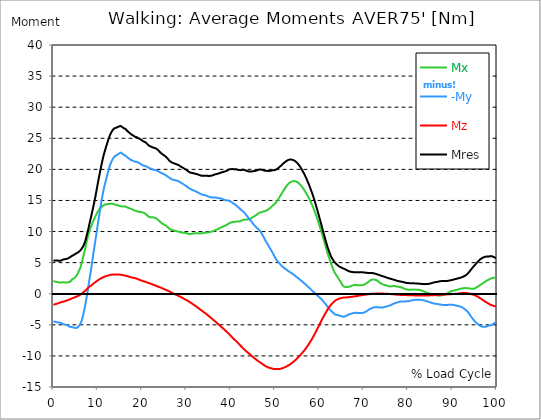
| Category |  Mx |  -My |  Mz |  Mres |
|---|---|---|---|---|
| 0.0 | 2.055 | -4.466 | -1.765 | 5.36 |
| 0.1647276845464841 | 2.007 | -4.449 | -1.733 | 5.312 |
| 0.3294553690929682 | 1.959 | -4.49 | -1.701 | 5.32 |
| 0.5044785339236075 | 1.935 | -4.538 | -1.669 | 5.336 |
| 0.6692062184700917 | 1.91 | -4.578 | -1.636 | 5.352 |
| 0.8339339030165757 | 1.878 | -4.595 | -1.596 | 5.344 |
| 0.9986615875630598 | 1.846 | -4.611 | -1.548 | 5.328 |
| 1.1633892721095438 | 1.806 | -4.635 | -1.515 | 5.32 |
| 1.3384124369401833 | 1.806 | -4.635 | -1.467 | 5.296 |
| 1.5031401214866673 | 1.822 | -4.651 | -1.419 | 5.304 |
| 1.6678678060331513 | 1.822 | -4.683 | -1.378 | 5.32 |
| 1.8325954905796356 | 1.822 | -4.74 | -1.346 | 5.36 |
| 1.9973231751261196 | 1.846 | -4.812 | -1.314 | 5.433 |
| 2.1620508596726036 | 1.83 | -4.877 | -1.298 | 5.481 |
| 2.337074024503243 | 1.822 | -4.925 | -1.266 | 5.522 |
| 2.501801709049727 | 1.814 | -4.949 | -1.225 | 5.538 |
| 2.666529393596211 | 1.814 | -4.973 | -1.185 | 5.554 |
| 2.8312570781426953 | 1.814 | -5.014 | -1.137 | 5.578 |
| 2.9959847626891793 | 1.822 | -5.054 | -1.096 | 5.61 |
| 3.1710079275198186 | 1.846 | -5.086 | -1.048 | 5.642 |
| 3.3357356120663026 | 1.838 | -5.143 | -1.008 | 5.691 |
| 3.500463296612787 | 1.806 | -5.247 | -0.975 | 5.763 |
| 3.665190981159271 | 1.878 | -5.304 | -0.927 | 5.844 |
| 3.8299186657057547 | 2.007 | -5.328 | -0.871 | 5.925 |
| 4.004941830536394 | 2.128 | -5.352 | -0.822 | 5.997 |
| 4.169669515082878 | 2.265 | -5.36 | -0.766 | 6.07 |
| 4.334397199629363 | 2.354 | -5.376 | -0.709 | 6.134 |
| 4.499124884175846 | 2.426 | -5.401 | -0.661 | 6.182 |
| 4.663852568722331 | 2.499 | -5.457 | -0.613 | 6.263 |
| 4.8285802532688145 | 2.587 | -5.489 | -0.572 | 6.336 |
| 5.003603418099454 | 2.7 | -5.522 | -0.532 | 6.416 |
| 5.168331102645938 | 2.821 | -5.53 | -0.484 | 6.489 |
| 5.333058787192422 | 3.031 | -5.473 | -0.435 | 6.561 |
| 5.497786471738906 | 3.265 | -5.384 | -0.379 | 6.626 |
| 5.662514156285391 | 3.522 | -5.264 | -0.314 | 6.698 |
| 5.83753732111603 | 3.78 | -5.135 | -0.25 | 6.803 |
| 6.0022650056625135 | 4.038 | -4.957 | -0.185 | 6.9 |
| 6.166992690208998 | 4.353 | -4.748 | -0.113 | 7.029 |
| 6.331720374755482 | 4.796 | -4.417 | -0.032 | 7.174 |
| 6.496448059301967 | 5.264 | -4.038 | 0.064 | 7.319 |
| 6.671471224132605 | 5.731 | -3.579 | 0.169 | 7.545 |
| 6.836198908679089 | 6.223 | -3.063 | 0.274 | 7.795 |
| 7.000926593225574 | 6.714 | -2.523 | 0.371 | 8.085 |
| 7.165654277772057 | 7.222 | -1.926 | 0.476 | 8.415 |
| 7.330381962318542 | 7.762 | -1.282 | 0.588 | 8.794 |
| 7.495109646865026 | 8.335 | -0.556 | 0.709 | 9.294 |
| 7.670132811695664 | 8.883 | 0.161 | 0.83 | 9.794 |
| 7.8348604962421495 | 9.342 | 0.879 | 0.943 | 10.253 |
| 7.999588180788634 | 9.753 | 1.636 | 1.056 | 10.769 |
| 8.164315865335118 | 10.124 | 2.418 | 1.153 | 11.325 |
| 8.329043549881602 | 10.463 | 3.16 | 1.233 | 11.849 |
| 8.504066714712243 | 10.777 | 3.909 | 1.322 | 12.357 |
| 8.668794399258726 | 11.075 | 4.691 | 1.411 | 12.865 |
| 8.833522083805208 | 11.414 | 5.505 | 1.515 | 13.421 |
| 8.998249768351693 | 11.68 | 6.328 | 1.612 | 13.953 |
| 9.162977452898177 | 11.922 | 7.118 | 1.709 | 14.517 |
| 9.338000617728817 | 12.188 | 7.899 | 1.798 | 15.106 |
| 9.5027283022753 | 12.462 | 8.673 | 1.886 | 15.702 |
| 9.667455986821786 | 12.712 | 9.463 | 1.967 | 16.339 |
| 9.83218367136827 | 12.953 | 10.277 | 2.055 | 16.992 |
| 9.996911355914754 | 13.171 | 11.075 | 2.144 | 17.645 |
| 10.171934520745392 | 13.364 | 11.833 | 2.217 | 18.273 |
| 10.336662205291876 | 13.55 | 12.583 | 2.297 | 18.894 |
| 10.501389889838359 | 13.719 | 13.34 | 2.37 | 19.507 |
| 10.666117574384844 | 13.848 | 14.074 | 2.442 | 20.095 |
| 10.830845258931328 | 13.945 | 14.783 | 2.499 | 20.659 |
| 10.995572943477812 | 14.034 | 15.46 | 2.563 | 21.207 |
| 11.170596108308452 | 14.122 | 16.129 | 2.628 | 21.748 |
| 11.335323792854936 | 14.219 | 16.734 | 2.684 | 22.247 |
| 11.50005147740142 | 14.291 | 17.25 | 2.741 | 22.683 |
| 11.664779161947905 | 14.34 | 17.733 | 2.781 | 23.086 |
| 11.829506846494388 | 14.372 | 18.209 | 2.821 | 23.489 |
| 12.004530011325027 | 14.388 | 18.676 | 2.862 | 23.867 |
| 12.169257695871512 | 14.396 | 19.144 | 2.894 | 24.254 |
| 12.333985380417996 | 14.412 | 19.587 | 2.926 | 24.617 |
| 12.498713064964479 | 14.428 | 20.031 | 2.966 | 24.98 |
| 12.663440749510965 | 14.453 | 20.45 | 2.999 | 25.334 |
| 12.838463914341604 | 14.469 | 20.78 | 3.023 | 25.609 |
| 13.003191598888087 | 14.493 | 21.046 | 3.047 | 25.834 |
| 13.167919283434573 | 14.493 | 21.361 | 3.063 | 26.092 |
| 13.332646967981058 | 14.501 | 21.562 | 3.071 | 26.261 |
| 13.497374652527538 | 14.477 | 21.78 | 3.079 | 26.423 |
| 13.662102337074025 | 14.412 | 21.933 | 3.087 | 26.527 |
| 13.837125501904662 | 14.348 | 22.086 | 3.095 | 26.616 |
| 14.001853186451148 | 14.316 | 22.159 | 3.095 | 26.656 |
| 14.166580870997631 | 14.283 | 22.239 | 3.103 | 26.705 |
| 14.331308555544114 | 14.243 | 22.336 | 3.103 | 26.761 |
| 14.4960362400906 | 14.227 | 22.376 | 3.095 | 26.793 |
| 14.671059404921238 | 14.179 | 22.425 | 3.079 | 26.802 |
| 14.835787089467724 | 14.154 | 22.57 | 3.079 | 26.914 |
| 15.000514774014206 | 14.138 | 22.723 | 3.071 | 27.035 |
| 15.165242458560689 | 14.09 | 22.683 | 3.055 | 26.971 |
| 15.329970143107175 | 14.034 | 22.642 | 3.031 | 26.906 |
| 15.504993307937815 | 14.025 | 22.562 | 3.007 | 26.826 |
| 15.669720992484299 | 14.009 | 22.473 | 2.982 | 26.737 |
| 15.834448677030782 | 14.009 | 22.368 | 2.958 | 26.64 |
| 15.999176361577268 | 14.017 | 22.28 | 2.934 | 26.56 |
| 16.16390404612375 | 14.017 | 22.255 | 2.91 | 26.544 |
| 16.33892721095439 | 14.001 | 22.191 | 2.886 | 26.471 |
| 16.503654895500876 | 13.953 | 22.054 | 2.853 | 26.318 |
| 16.668382580047357 | 13.88 | 21.917 | 2.821 | 26.165 |
| 16.833110264593845 | 13.816 | 21.852 | 2.797 | 26.068 |
| 16.997837949140326 | 13.792 | 21.772 | 2.757 | 25.979 |
| 17.16256563368681 | 13.751 | 21.691 | 2.724 | 25.891 |
| 17.33758879851745 | 13.703 | 21.602 | 2.684 | 25.778 |
| 17.502316483063932 | 13.647 | 21.498 | 2.644 | 25.657 |
| 17.667044167610417 | 13.606 | 21.449 | 2.62 | 25.584 |
| 17.8317718521569 | 13.558 | 21.425 | 2.596 | 25.536 |
| 17.996499536703386 | 13.518 | 21.361 | 2.571 | 25.447 |
| 18.171522701534023 | 13.445 | 21.304 | 2.547 | 25.359 |
| 18.33625038608051 | 13.364 | 21.256 | 2.515 | 25.27 |
| 18.500978070626992 | 13.324 | 21.216 | 2.491 | 25.214 |
| 18.665705755173477 | 13.292 | 21.183 | 2.458 | 25.165 |
| 18.83043343971996 | 13.26 | 21.216 | 2.418 | 25.173 |
| 19.0054566045506 | 13.219 | 21.151 | 2.37 | 25.093 |
| 19.170184289097087 | 13.187 | 21.07 | 2.321 | 25.004 |
| 19.33491197364357 | 13.163 | 20.998 | 2.273 | 24.923 |
| 19.499639658190056 | 13.179 | 20.958 | 2.225 | 24.891 |
| 19.66436734273654 | 13.171 | 20.901 | 2.176 | 24.843 |
| 19.82909502728302 | 13.139 | 20.821 | 2.128 | 24.754 |
| 20.004118192113662 | 13.098 | 20.724 | 2.088 | 24.641 |
| 20.168845876660146 | 13.066 | 20.643 | 2.047 | 24.561 |
| 20.33357356120663 | 13.026 | 20.587 | 2.007 | 24.488 |
| 20.49830124575311 | 12.986 | 20.571 | 1.975 | 24.44 |
| 20.663028930299596 | 12.929 | 20.546 | 1.935 | 24.383 |
| 20.838052095130234 | 12.841 | 20.53 | 1.894 | 24.319 |
| 21.002779779676718 | 12.728 | 20.458 | 1.854 | 24.198 |
| 21.167507464223206 | 12.607 | 20.393 | 1.806 | 24.077 |
| 21.332235148769687 | 12.486 | 20.329 | 1.765 | 23.964 |
| 21.496962833316175 | 12.381 | 20.264 | 1.717 | 23.851 |
| 21.671985998146813 | 12.309 | 20.208 | 1.677 | 23.763 |
| 21.836713682693297 | 12.276 | 20.16 | 1.636 | 23.698 |
| 22.00144136723978 | 12.268 | 20.111 | 1.596 | 23.658 |
| 22.166169051786262 | 12.309 | 20.063 | 1.556 | 23.634 |
| 22.33089673633275 | 12.333 | 20.014 | 1.515 | 23.593 |
| 22.505919901163388 | 12.284 | 19.95 | 1.467 | 23.513 |
| 22.670647585709872 | 12.236 | 19.926 | 1.419 | 23.472 |
| 22.835375270256357 | 12.196 | 19.91 | 1.37 | 23.432 |
| 23.00010295480284 | 12.163 | 19.894 | 1.322 | 23.4 |
| 23.164830639349326 | 12.123 | 19.869 | 1.274 | 23.36 |
| 23.32955832389581 | 12.051 | 19.821 | 1.225 | 23.279 |
| 23.50458148872645 | 11.97 | 19.765 | 1.177 | 23.174 |
| 23.66930917327293 | 11.865 | 19.692 | 1.137 | 23.061 |
| 23.834036857819417 | 11.752 | 19.628 | 1.088 | 22.94 |
| 23.998764542365898 | 11.623 | 19.555 | 1.04 | 22.812 |
| 24.163492226912382 | 11.511 | 19.482 | 0.991 | 22.691 |
| 24.338515391743023 | 11.398 | 19.418 | 0.951 | 22.578 |
| 24.503243076289504 | 11.317 | 19.37 | 0.895 | 22.489 |
| 24.667970760835992 | 11.245 | 19.321 | 0.846 | 22.408 |
| 24.832698445382476 | 11.18 | 19.265 | 0.79 | 22.32 |
| 24.997426129928957 | 11.132 | 19.216 | 0.742 | 22.255 |
| 25.1724492947596 | 11.067 | 19.152 | 0.693 | 22.167 |
| 25.337176979306086 | 10.987 | 19.071 | 0.637 | 22.054 |
| 25.501904663852567 | 10.906 | 18.991 | 0.588 | 21.941 |
| 25.66663234839905 | 10.809 | 18.91 | 0.532 | 21.828 |
| 25.831360032945536 | 10.696 | 18.822 | 0.476 | 21.691 |
| 25.99608771749202 | 10.567 | 18.733 | 0.419 | 21.554 |
| 26.171110882322658 | 10.438 | 18.644 | 0.363 | 21.401 |
| 26.335838566869146 | 10.342 | 18.556 | 0.306 | 21.28 |
| 26.50056625141563 | 10.293 | 18.483 | 0.242 | 21.199 |
| 26.665293935962115 | 10.245 | 18.435 | 0.185 | 21.127 |
| 26.830021620508592 | 10.213 | 18.378 | 0.129 | 21.07 |
| 27.00504478533923 | 10.197 | 18.33 | 0.064 | 21.022 |
| 27.169772469885718 | 10.189 | 18.298 | 0.008 | 20.982 |
| 27.334500154432202 | 10.156 | 18.273 | -0.04 | 20.941 |
| 27.499227838978687 | 10.124 | 18.241 | -0.105 | 20.893 |
| 27.66395552352517 | 10.108 | 18.193 | -0.161 | 20.845 |
| 27.83897868835581 | 10.052 | 18.185 | -0.202 | 20.804 |
| 28.003706372902297 | 10.019 | 18.169 | -0.258 | 20.772 |
| 28.168434057448778 | 9.987 | 18.12 | -0.314 | 20.716 |
| 28.333161741995262 | 9.955 | 18.048 | -0.379 | 20.643 |
| 28.497889426541747 | 9.931 | 17.975 | -0.443 | 20.571 |
| 28.662617111088228 | 9.89 | 17.903 | -0.5 | 20.49 |
| 28.837640275918872 | 9.842 | 17.83 | -0.564 | 20.401 |
| 29.002367960465357 | 9.826 | 17.758 | -0.629 | 20.337 |
| 29.167095645011837 | 9.826 | 17.685 | -0.701 | 20.28 |
| 29.331823329558322 | 9.85 | 17.62 | -0.766 | 20.232 |
| 29.496551014104806 | 9.802 | 17.524 | -0.83 | 20.127 |
| 29.671574178935447 | 9.778 | 17.467 | -0.895 | 20.071 |
| 29.836301863481932 | 9.761 | 17.395 | -0.951 | 19.998 |
| 30.001029548028413 | 9.729 | 17.298 | -1.016 | 19.91 |
| 30.165757232574894 | 9.705 | 17.209 | -1.088 | 19.829 |
| 30.330484917121378 | 9.665 | 17.121 | -1.153 | 19.732 |
| 30.505508081952023 | 9.624 | 17.024 | -1.225 | 19.636 |
| 30.670235766498504 | 9.584 | 16.935 | -1.29 | 19.547 |
| 30.834963451044988 | 9.576 | 16.863 | -1.362 | 19.482 |
| 30.999691135591473 | 9.6 | 16.814 | -1.443 | 19.466 |
| 31.16441882013796 | 9.64 | 16.766 | -1.532 | 19.45 |
| 31.339441984968598 | 9.673 | 16.718 | -1.612 | 19.434 |
| 31.50416966951508 | 9.689 | 16.645 | -1.693 | 19.386 |
| 31.668897354061563 | 9.697 | 16.581 | -1.773 | 19.354 |
| 31.833625038608048 | 9.705 | 16.54 | -1.854 | 19.329 |
| 31.998352723154536 | 9.713 | 16.492 | -1.935 | 19.305 |
| 32.16308040770102 | 9.713 | 16.444 | -2.023 | 19.273 |
| 32.33810357253166 | 9.721 | 16.387 | -2.112 | 19.241 |
| 32.502831257078135 | 9.721 | 16.331 | -2.201 | 19.208 |
| 32.66755894162463 | 9.713 | 16.266 | -2.289 | 19.16 |
| 32.83228662617111 | 9.705 | 16.202 | -2.378 | 19.112 |
| 32.99701431071759 | 9.697 | 16.121 | -2.467 | 19.071 |
| 33.17203747554823 | 9.705 | 16.065 | -2.547 | 19.031 |
| 33.336765160094714 | 9.705 | 16.008 | -2.636 | 18.999 |
| 33.5014928446412 | 9.713 | 15.952 | -2.733 | 18.967 |
| 33.66622052918769 | 9.737 | 15.912 | -2.821 | 18.967 |
| 33.83094821373417 | 9.769 | 15.896 | -2.91 | 18.975 |
| 34.00597137856481 | 9.794 | 15.871 | -2.999 | 18.991 |
| 34.17069906311129 | 9.818 | 15.839 | -3.087 | 18.991 |
| 34.33542674765778 | 9.834 | 15.815 | -3.168 | 18.991 |
| 34.50015443220426 | 9.85 | 15.783 | -3.256 | 18.991 |
| 34.664882116750746 | 9.85 | 15.726 | -3.353 | 18.975 |
| 34.829609801297224 | 9.85 | 15.662 | -3.466 | 18.95 |
| 35.004632966127865 | 9.866 | 15.621 | -3.563 | 18.95 |
| 35.169360650674356 | 9.874 | 15.589 | -3.66 | 18.942 |
| 35.334088335220834 | 9.906 | 15.557 | -3.756 | 18.95 |
| 35.49881601976732 | 9.939 | 15.517 | -3.845 | 18.967 |
| 35.6635437043138 | 9.979 | 15.492 | -3.942 | 18.991 |
| 35.838566869144444 | 10.019 | 15.476 | -4.046 | 19.015 |
| 36.00329455369093 | 10.06 | 15.484 | -4.159 | 19.055 |
| 36.16802223823741 | 10.1 | 15.492 | -4.248 | 19.112 |
| 36.3327499227839 | 10.156 | 15.501 | -4.345 | 19.16 |
| 36.497477607330374 | 10.205 | 15.492 | -4.441 | 19.2 |
| 36.67250077216102 | 10.245 | 15.468 | -4.546 | 19.225 |
| 36.83722845670751 | 10.301 | 15.444 | -4.651 | 19.249 |
| 37.001956141253984 | 10.366 | 15.42 | -4.764 | 19.289 |
| 37.166683825800476 | 10.422 | 15.388 | -4.869 | 19.313 |
| 37.33141151034695 | 10.471 | 15.347 | -4.973 | 19.329 |
| 37.496139194893445 | 10.543 | 15.339 | -5.086 | 19.386 |
| 37.671162359724086 | 10.6 | 15.323 | -5.191 | 19.442 |
| 37.83589004427056 | 10.656 | 15.307 | -5.296 | 19.491 |
| 38.00061772881704 | 10.721 | 15.267 | -5.401 | 19.523 |
| 38.16534541336353 | 10.777 | 15.235 | -5.505 | 19.571 |
| 38.33007309791002 | 10.825 | 15.178 | -5.61 | 19.595 |
| 38.50509626274065 | 10.874 | 15.122 | -5.715 | 19.62 |
| 38.66982394728714 | 10.922 | 15.089 | -5.828 | 19.652 |
| 38.83455163183362 | 10.97 | 15.049 | -5.941 | 19.684 |
| 38.99927931638011 | 11.027 | 15.017 | -6.045 | 19.732 |
| 39.16400700092659 | 11.099 | 14.993 | -6.15 | 19.781 |
| 39.33903016575723 | 11.172 | 14.985 | -6.263 | 19.853 |
| 39.503757850303714 | 11.261 | 14.977 | -6.384 | 19.934 |
| 39.6684855348502 | 11.349 | 14.944 | -6.505 | 20.006 |
| 39.83321321939669 | 11.406 | 14.888 | -6.634 | 20.031 |
| 39.99794090394317 | 11.446 | 14.815 | -6.763 | 20.039 |
| 40.1729640687738 | 11.47 | 14.735 | -6.884 | 20.039 |
| 40.33769175332029 | 11.511 | 14.654 | -7.013 | 20.047 |
| 40.50241943786678 | 11.527 | 14.574 | -7.134 | 20.039 |
| 40.66714712241326 | 11.543 | 14.493 | -7.246 | 20.031 |
| 40.831874806959746 | 11.567 | 14.412 | -7.367 | 20.031 |
| 40.99660249150622 | 11.599 | 14.356 | -7.472 | 20.047 |
| 41.17162565633686 | 11.599 | 14.259 | -7.593 | 20.023 |
| 41.336353340883356 | 11.599 | 14.154 | -7.706 | 19.99 |
| 41.50108102542983 | 11.599 | 14.042 | -7.819 | 19.958 |
| 41.66580870997632 | 11.599 | 13.937 | -7.94 | 19.926 |
| 41.8305363945228 | 11.607 | 13.832 | -8.053 | 19.91 |
| 42.005559559353436 | 11.631 | 13.727 | -8.173 | 19.894 |
| 42.17028724389993 | 11.656 | 13.606 | -8.302 | 19.869 |
| 42.33501492844641 | 11.704 | 13.485 | -8.431 | 19.861 |
| 42.4997426129929 | 11.768 | 13.397 | -8.552 | 19.894 |
| 42.664470297539374 | 11.833 | 13.324 | -8.673 | 19.934 |
| 42.839493462370015 | 11.889 | 13.244 | -8.794 | 19.966 |
| 43.00422114691651 | 11.906 | 13.107 | -8.915 | 19.926 |
| 43.168948831462984 | 11.914 | 12.97 | -9.028 | 19.886 |
| 43.33367651600947 | 11.914 | 12.832 | -9.133 | 19.845 |
| 43.49840420055595 | 11.922 | 12.671 | -9.237 | 19.797 |
| 43.66313188510244 | 11.93 | 12.518 | -9.342 | 19.757 |
| 43.83815504993308 | 11.946 | 12.373 | -9.439 | 19.716 |
| 44.00288273447956 | 11.97 | 12.204 | -9.536 | 19.676 |
| 44.16761041902604 | 12.002 | 12.043 | -9.64 | 19.644 |
| 44.332338103572525 | 12.034 | 11.897 | -9.737 | 19.628 |
| 44.49706578811901 | 12.091 | 11.768 | -9.842 | 19.636 |
| 44.67208895294965 | 12.163 | 11.631 | -9.955 | 19.66 |
| 44.836816637496135 | 12.252 | 11.478 | -10.068 | 19.684 |
| 45.00154432204262 | 12.333 | 11.309 | -10.164 | 19.7 |
| 45.166272006589104 | 12.397 | 11.156 | -10.269 | 19.716 |
| 45.33099969113559 | 12.454 | 11.003 | -10.358 | 19.716 |
| 45.50602285596623 | 12.526 | 10.874 | -10.455 | 19.74 |
| 45.670750540512714 | 12.607 | 10.769 | -10.543 | 19.773 |
| 45.83547822505919 | 12.695 | 10.656 | -10.632 | 19.813 |
| 46.00020590960568 | 12.792 | 10.543 | -10.721 | 19.861 |
| 46.16493359415217 | 12.889 | 10.447 | -10.809 | 19.918 |
| 46.3399567589828 | 12.953 | 10.326 | -10.898 | 19.942 |
| 46.50468444352929 | 13.026 | 10.205 | -10.979 | 19.974 |
| 46.66941212807577 | 13.082 | 10.044 | -11.059 | 19.99 |
| 46.83413981262226 | 13.098 | 9.858 | -11.132 | 19.966 |
| 46.99886749716874 | 13.139 | 9.673 | -11.212 | 19.934 |
| 47.16359518171523 | 13.179 | 9.479 | -11.301 | 19.926 |
| 47.33861834654586 | 13.211 | 9.254 | -11.39 | 19.894 |
| 47.50334603109235 | 13.236 | 9.012 | -11.478 | 19.837 |
| 47.66807371563883 | 13.276 | 8.778 | -11.551 | 19.797 |
| 47.83280140018532 | 13.308 | 8.552 | -11.623 | 19.757 |
| 47.997529084731795 | 13.364 | 8.351 | -11.688 | 19.748 |
| 48.172552249562436 | 13.437 | 8.173 | -11.752 | 19.765 |
| 48.33727993410892 | 13.51 | 7.956 | -11.825 | 19.748 |
| 48.502007618655405 | 13.55 | 7.754 | -11.857 | 19.732 |
| 48.6667353032019 | 13.647 | 7.545 | -11.897 | 19.748 |
| 48.831462987748374 | 13.751 | 7.351 | -11.93 | 19.765 |
| 49.00648615257901 | 13.856 | 7.158 | -11.97 | 19.789 |
| 49.17121383712551 | 13.945 | 6.948 | -11.994 | 19.797 |
| 49.335941521671984 | 14.074 | 6.755 | -12.034 | 19.829 |
| 49.50066920621847 | 14.195 | 6.521 | -12.067 | 19.869 |
| 49.66539689076495 | 14.291 | 6.287 | -12.091 | 19.877 |
| 49.83012457531144 | 14.372 | 6.054 | -12.099 | 19.877 |
| 50.00514774014208 | 14.493 | 5.836 | -12.107 | 19.902 |
| 50.16987542468856 | 14.622 | 5.634 | -12.115 | 19.942 |
| 50.33460310923505 | 14.783 | 5.449 | -12.123 | 19.998 |
| 50.499330793781525 | 14.952 | 5.288 | -12.123 | 20.071 |
| 50.66405847832801 | 15.122 | 5.143 | -12.115 | 20.168 |
| 50.83908164315865 | 15.307 | 5.006 | -12.107 | 20.256 |
| 51.003809327705135 | 15.501 | 4.877 | -12.099 | 20.361 |
| 51.16853701225162 | 15.71 | 4.748 | -12.075 | 20.474 |
| 51.3332646967981 | 15.904 | 4.619 | -12.051 | 20.587 |
| 51.49799238134458 | 16.081 | 4.474 | -12.018 | 20.675 |
| 51.67301554617522 | 16.274 | 4.369 | -11.978 | 20.788 |
| 51.837743230721706 | 16.5 | 4.28 | -11.93 | 20.917 |
| 52.00247091526819 | 16.677 | 4.175 | -11.881 | 21.006 |
| 52.16719859981468 | 16.879 | 4.087 | -11.841 | 21.127 |
| 52.33192628436116 | 17.056 | 4.006 | -11.793 | 21.224 |
| 52.5069494491918 | 17.217 | 3.917 | -11.728 | 21.304 |
| 52.67167713373829 | 17.379 | 3.829 | -11.664 | 21.385 |
| 52.83640481828477 | 17.524 | 3.74 | -11.607 | 21.449 |
| 53.00113250283126 | 17.661 | 3.668 | -11.535 | 21.514 |
| 53.16586018737774 | 17.782 | 3.571 | -11.47 | 21.554 |
| 53.33058787192423 | 17.87 | 3.49 | -11.398 | 21.578 |
| 53.50561103675487 | 17.967 | 3.426 | -11.317 | 21.602 |
| 53.67033872130134 | 18.007 | 3.345 | -11.22 | 21.578 |
| 53.83506640584783 | 18.048 | 3.265 | -11.132 | 21.554 |
| 53.99979409039431 | 18.072 | 3.176 | -11.035 | 21.514 |
| 54.164521774940795 | 18.104 | 3.095 | -10.938 | 21.482 |
| 54.339544939771436 | 18.112 | 3.007 | -10.833 | 21.425 |
| 54.50427262431792 | 18.096 | 2.91 | -10.729 | 21.353 |
| 54.669000308864405 | 18.064 | 2.813 | -10.624 | 21.256 |
| 54.83372799341089 | 18.015 | 2.716 | -10.511 | 21.151 |
| 54.998455677957374 | 17.967 | 2.628 | -10.398 | 21.046 |
| 55.173478842788015 | 17.886 | 2.539 | -10.277 | 20.917 |
| 55.3382065273345 | 17.782 | 2.442 | -10.156 | 20.756 |
| 55.502934211880984 | 17.677 | 2.338 | -10.035 | 20.595 |
| 55.66766189642746 | 17.556 | 2.241 | -9.906 | 20.426 |
| 55.83238958097395 | 17.419 | 2.144 | -9.778 | 20.232 |
| 55.997117265520444 | 17.274 | 2.047 | -9.64 | 20.031 |
| 56.17214043035107 | 17.121 | 1.951 | -9.503 | 19.829 |
| 56.336868114897555 | 16.96 | 1.846 | -9.366 | 19.611 |
| 56.50159579944404 | 16.782 | 1.741 | -9.221 | 19.386 |
| 56.666323483990524 | 16.597 | 1.636 | -9.068 | 19.144 |
| 56.83105116853701 | 16.411 | 1.532 | -8.915 | 18.902 |
| 57.00607433336764 | 16.226 | 1.427 | -8.754 | 18.652 |
| 57.170802017914134 | 16.008 | 1.33 | -8.585 | 18.37 |
| 57.33552970246061 | 15.799 | 1.217 | -8.407 | 18.096 |
| 57.5002573870071 | 15.573 | 1.096 | -8.238 | 17.814 |
| 57.66498507155359 | 15.347 | 0.983 | -8.053 | 17.524 |
| 57.84000823638422 | 15.106 | 0.879 | -7.867 | 17.217 |
| 58.00473592093071 | 14.856 | 0.766 | -7.674 | 16.903 |
| 58.16946360547718 | 14.598 | 0.653 | -7.48 | 16.581 |
| 58.334191290023675 | 14.332 | 0.532 | -7.279 | 16.25 |
| 58.49891897457017 | 14.058 | 0.419 | -7.069 | 15.912 |
| 58.663646659116644 | 13.768 | 0.306 | -6.86 | 15.557 |
| 58.838669823947285 | 13.477 | 0.193 | -6.634 | 15.186 |
| 59.00339750849377 | 13.155 | 0.081 | -6.408 | 14.807 |
| 59.168125193040254 | 12.824 | -0.032 | -6.182 | 14.404 |
| 59.33285287758674 | 12.478 | -0.137 | -5.957 | 13.993 |
| 59.49758056213322 | 12.115 | -0.242 | -5.723 | 13.566 |
| 59.672603726963864 | 11.768 | -0.347 | -5.489 | 13.155 |
| 59.83733141151035 | 11.406 | -0.451 | -5.247 | 12.72 |
| 60.002059096056826 | 11.035 | -0.564 | -5.006 | 12.284 |
| 60.16678678060332 | 10.68 | -0.677 | -4.764 | 11.865 |
| 60.33151446514979 | 10.301 | -0.782 | -4.522 | 11.43 |
| 60.506537629980436 | 9.906 | -0.903 | -4.288 | 10.987 |
| 60.67126531452693 | 9.479 | -1.032 | -4.063 | 10.527 |
| 60.8359929990734 | 9.076 | -1.169 | -3.845 | 10.092 |
| 61.00072068361989 | 8.665 | -1.314 | -3.627 | 9.649 |
| 61.165448368166366 | 8.254 | -1.459 | -3.41 | 9.221 |
| 61.34047153299701 | 7.843 | -1.604 | -3.2 | 8.794 |
| 61.5051992175435 | 7.432 | -1.741 | -2.999 | 8.375 |
| 61.669926902089976 | 7.013 | -1.894 | -2.789 | 7.948 |
| 61.83465458663647 | 6.61 | -2.055 | -2.587 | 7.553 |
| 61.999382271182945 | 6.231 | -2.209 | -2.394 | 7.198 |
| 62.16410995572944 | 5.868 | -2.346 | -2.225 | 6.876 |
| 62.33913312056008 | 5.505 | -2.499 | -2.055 | 6.553 |
| 62.50386080510655 | 5.135 | -2.636 | -1.894 | 6.239 |
| 62.66858848965305 | 4.796 | -2.773 | -1.741 | 5.949 |
| 62.83331617419952 | 4.506 | -2.862 | -1.628 | 5.747 |
| 62.998043858746 | 4.192 | -2.974 | -1.499 | 5.538 |
| 63.17306702357666 | 3.869 | -3.103 | -1.378 | 5.344 |
| 63.33779470812313 | 3.579 | -3.224 | -1.257 | 5.175 |
| 63.50252239266961 | 3.345 | -3.305 | -1.153 | 5.022 |
| 63.667250077216096 | 3.168 | -3.345 | -1.072 | 4.909 |
| 63.83197776176258 | 2.974 | -3.41 | -0.991 | 4.78 |
| 64.00700092659322 | 2.813 | -3.426 | -0.935 | 4.675 |
| 64.1717286111397 | 2.644 | -3.442 | -0.887 | 4.554 |
| 64.33645629568619 | 2.434 | -3.474 | -0.838 | 4.449 |
| 64.50118398023267 | 2.241 | -3.506 | -0.798 | 4.377 |
| 64.66591166477916 | 2.072 | -3.531 | -0.758 | 4.312 |
| 64.83063934932565 | 1.878 | -3.571 | -0.717 | 4.256 |
| 65.00566251415627 | 1.693 | -3.619 | -0.685 | 4.208 |
| 65.17039019870276 | 1.483 | -3.668 | -0.653 | 4.143 |
| 65.33511788324925 | 1.29 | -3.708 | -0.629 | 4.079 |
| 65.49984556779573 | 1.177 | -3.7 | -0.613 | 4.038 |
| 65.66457325234222 | 1.112 | -3.676 | -0.596 | 3.99 |
| 65.83959641717286 | 1.088 | -3.619 | -0.596 | 3.926 |
| 66.00432410171935 | 1.072 | -3.563 | -0.588 | 3.869 |
| 66.16905178626584 | 1.064 | -3.506 | -0.588 | 3.813 |
| 66.3337794708123 | 1.072 | -3.45 | -0.58 | 3.748 |
| 66.4985071553588 | 1.104 | -3.385 | -0.572 | 3.684 |
| 66.67353032018943 | 1.137 | -3.329 | -0.556 | 3.627 |
| 66.83825800473592 | 1.161 | -3.281 | -0.54 | 3.579 |
| 67.0029856892824 | 1.177 | -3.248 | -0.524 | 3.547 |
| 67.16771337382887 | 1.201 | -3.216 | -0.508 | 3.514 |
| 67.33244105837538 | 1.29 | -3.176 | -0.5 | 3.498 |
| 67.49716874292186 | 1.338 | -3.144 | -0.476 | 3.49 |
| 67.67219190775249 | 1.378 | -3.111 | -0.459 | 3.474 |
| 67.83691959229898 | 1.411 | -3.087 | -0.443 | 3.458 |
| 68.00164727684546 | 1.427 | -3.063 | -0.427 | 3.442 |
| 68.16637496139195 | 1.427 | -3.055 | -0.403 | 3.434 |
| 68.33110264593842 | 1.411 | -3.063 | -0.387 | 3.434 |
| 68.50612581076906 | 1.394 | -3.079 | -0.371 | 3.442 |
| 68.67085349531555 | 1.386 | -3.087 | -0.347 | 3.442 |
| 68.83558117986203 | 1.37 | -3.095 | -0.33 | 3.442 |
| 69.00030886440852 | 1.354 | -3.111 | -0.306 | 3.45 |
| 69.165036548955 | 1.354 | -3.111 | -0.282 | 3.45 |
| 69.34005971378564 | 1.378 | -3.103 | -0.258 | 3.45 |
| 69.50478739833213 | 1.37 | -3.103 | -0.242 | 3.458 |
| 69.66951508287862 | 1.37 | -3.103 | -0.218 | 3.458 |
| 69.8342427674251 | 1.386 | -3.079 | -0.202 | 3.442 |
| 69.99897045197157 | 1.427 | -3.047 | -0.185 | 3.426 |
| 70.17399361680222 | 1.483 | -2.999 | -0.169 | 3.41 |
| 70.33872130134871 | 1.54 | -2.942 | -0.153 | 3.394 |
| 70.50344898589518 | 1.612 | -2.886 | -0.137 | 3.369 |
| 70.66817667044167 | 1.701 | -2.821 | -0.121 | 3.361 |
| 70.83290435498816 | 1.781 | -2.741 | -0.105 | 3.345 |
| 70.99763203953464 | 1.878 | -2.644 | -0.097 | 3.345 |
| 71.17265520436527 | 1.967 | -2.563 | -0.081 | 3.337 |
| 71.33738288891176 | 2.055 | -2.491 | -0.064 | 3.337 |
| 71.50211057345825 | 2.136 | -2.426 | -0.048 | 3.345 |
| 71.66683825800473 | 2.217 | -2.362 | -0.032 | 3.345 |
| 71.83156594255121 | 2.257 | -2.321 | -0.016 | 3.345 |
| 72.00658910738186 | 2.281 | -2.273 | -0.008 | 3.321 |
| 72.17131679192833 | 2.281 | -2.233 | 0.008 | 3.297 |
| 72.33604447647483 | 2.273 | -2.209 | 0.008 | 3.273 |
| 72.5007721610213 | 2.257 | -2.184 | 0.016 | 3.24 |
| 72.6654998455678 | 2.233 | -2.16 | 0.024 | 3.208 |
| 72.84052301039843 | 2.201 | -2.152 | 0.032 | 3.176 |
| 73.0052506949449 | 2.144 | -2.152 | 0.032 | 3.136 |
| 73.1699783794914 | 2.064 | -2.16 | 0.032 | 3.087 |
| 73.33470606403789 | 1.967 | -2.184 | 0.032 | 3.047 |
| 73.49943374858437 | 1.846 | -2.209 | 0.04 | 3.007 |
| 73.66416143313084 | 1.757 | -2.225 | 0.04 | 2.966 |
| 73.83918459796149 | 1.677 | -2.233 | 0.04 | 2.926 |
| 74.00391228250797 | 1.612 | -2.233 | 0.032 | 2.894 |
| 74.16863996705446 | 1.564 | -2.225 | 0.032 | 2.853 |
| 74.33336765160095 | 1.499 | -2.209 | 0.024 | 2.805 |
| 74.49809533614743 | 1.467 | -2.176 | 0.016 | 2.773 |
| 74.67311850097806 | 1.435 | -2.144 | 0.016 | 2.741 |
| 74.83784618552455 | 1.411 | -2.104 | 0.008 | 2.708 |
| 75.00257387007105 | 1.37 | -2.08 | 0 | 2.652 |
| 75.16730155461751 | 1.314 | -2.047 | -0.008 | 2.604 |
| 75.332029239164 | 1.274 | -2.015 | -0.016 | 2.555 |
| 75.50705240399465 | 1.241 | -1.983 | -0.016 | 2.515 |
| 75.67178008854113 | 1.217 | -1.943 | -0.032 | 2.483 |
| 75.8365077730876 | 1.185 | -1.91 | -0.04 | 2.458 |
| 76.00123545763408 | 1.161 | -1.878 | -0.048 | 2.426 |
| 76.16596314218059 | 1.169 | -1.822 | -0.064 | 2.394 |
| 76.34098630701122 | 1.201 | -1.749 | -0.073 | 2.354 |
| 76.5057139915577 | 1.225 | -1.685 | -0.081 | 2.313 |
| 76.67044167610419 | 1.241 | -1.628 | -0.097 | 2.281 |
| 76.83516936065067 | 1.241 | -1.58 | -0.105 | 2.249 |
| 76.99989704519716 | 1.233 | -1.532 | -0.121 | 2.217 |
| 77.16462472974364 | 1.209 | -1.499 | -0.129 | 2.176 |
| 77.33964789457428 | 1.177 | -1.459 | -0.137 | 2.136 |
| 77.50437557912076 | 1.137 | -1.419 | -0.153 | 2.088 |
| 77.66910326366724 | 1.12 | -1.378 | -0.161 | 2.055 |
| 77.83383094821373 | 1.104 | -1.338 | -0.169 | 2.031 |
| 77.99855863276022 | 1.096 | -1.306 | -0.177 | 2.007 |
| 78.17358179759084 | 1.08 | -1.274 | -0.185 | 1.983 |
| 78.33830948213735 | 1.056 | -1.249 | -0.193 | 1.959 |
| 78.50303716668382 | 1.04 | -1.233 | -0.202 | 1.943 |
| 78.6677648512303 | 0.991 | -1.225 | -0.21 | 1.918 |
| 78.8324925357768 | 0.935 | -1.233 | -0.21 | 1.894 |
| 79.00751570060743 | 0.879 | -1.233 | -0.218 | 1.862 |
| 79.17224338515392 | 0.822 | -1.241 | -0.218 | 1.822 |
| 79.3369710697004 | 0.766 | -1.241 | -0.218 | 1.789 |
| 79.50169875424687 | 0.717 | -1.233 | -0.218 | 1.757 |
| 79.66642643879338 | 0.685 | -1.225 | -0.226 | 1.733 |
| 79.83115412333984 | 0.669 | -1.201 | -0.226 | 1.725 |
| 80.00617728817049 | 0.661 | -1.201 | -0.226 | 1.725 |
| 80.17090497271697 | 0.645 | -1.193 | -0.234 | 1.709 |
| 80.33563265726346 | 0.637 | -1.177 | -0.234 | 1.693 |
| 80.50036034180994 | 0.629 | -1.145 | -0.242 | 1.677 |
| 80.66508802635641 | 0.645 | -1.12 | -0.242 | 1.677 |
| 80.84011119118706 | 0.669 | -1.072 | -0.25 | 1.685 |
| 81.00483887573355 | 0.677 | -1.04 | -0.25 | 1.693 |
| 81.16956656028003 | 0.661 | -1.032 | -0.258 | 1.677 |
| 81.33429424482652 | 0.653 | -1.016 | -0.266 | 1.669 |
| 81.499021929373 | 0.653 | -0.991 | -0.274 | 1.66 |
| 81.67404509420363 | 0.661 | -0.975 | -0.282 | 1.66 |
| 81.83877277875014 | 0.661 | -0.959 | -0.282 | 1.652 |
| 82.00350046329662 | 0.653 | -0.951 | -0.29 | 1.644 |
| 82.1682281478431 | 0.645 | -0.951 | -0.29 | 1.636 |
| 82.33295583238957 | 0.645 | -0.943 | -0.298 | 1.628 |
| 82.50797899722022 | 0.621 | -0.951 | -0.298 | 1.62 |
| 82.67270668176671 | 0.596 | -0.967 | -0.298 | 1.604 |
| 82.83743436631318 | 0.564 | -0.983 | -0.298 | 1.596 |
| 83.00216205085967 | 0.524 | -1 | -0.298 | 1.58 |
| 83.16688973540616 | 0.484 | -1.016 | -0.298 | 1.564 |
| 83.33161741995264 | 0.435 | -1.032 | -0.298 | 1.556 |
| 83.50664058478327 | 0.395 | -1.056 | -0.298 | 1.548 |
| 83.67136826932976 | 0.355 | -1.08 | -0.298 | 1.54 |
| 83.83609595387625 | 0.306 | -1.112 | -0.29 | 1.54 |
| 84.00082363842272 | 0.266 | -1.153 | -0.29 | 1.556 |
| 84.16555132296921 | 0.21 | -1.193 | -0.29 | 1.556 |
| 84.34057448779986 | 0.153 | -1.225 | -0.282 | 1.556 |
| 84.50530217234633 | 0.105 | -1.266 | -0.282 | 1.564 |
| 84.67002985689282 | 0.064 | -1.298 | -0.274 | 1.58 |
| 84.83475754143929 | 0.016 | -1.338 | -0.266 | 1.612 |
| 84.9994852259858 | -0.04 | -1.386 | -0.266 | 1.644 |
| 85.17450839081643 | -0.113 | -1.427 | -0.258 | 1.677 |
| 85.3392360753629 | -0.153 | -1.467 | -0.25 | 1.709 |
| 85.5039637599094 | -0.185 | -1.499 | -0.242 | 1.749 |
| 85.66869144445587 | -0.202 | -1.532 | -0.234 | 1.781 |
| 85.83341912900237 | -0.21 | -1.564 | -0.234 | 1.814 |
| 85.99814681354884 | -0.218 | -1.58 | -0.226 | 1.838 |
| 86.17316997837949 | -0.226 | -1.604 | -0.218 | 1.862 |
| 86.33789766292597 | -0.242 | -1.628 | -0.21 | 1.878 |
| 86.50262534747245 | -0.258 | -1.636 | -0.202 | 1.894 |
| 86.66735303201894 | -0.282 | -1.66 | -0.193 | 1.918 |
| 86.83208071656543 | -0.298 | -1.685 | -0.185 | 1.951 |
| 87.00710388139605 | -0.306 | -1.709 | -0.185 | 1.975 |
| 87.17183156594255 | -0.298 | -1.725 | -0.177 | 1.991 |
| 87.33655925048905 | -0.282 | -1.741 | -0.169 | 2.015 |
| 87.50128693503551 | -0.266 | -1.757 | -0.153 | 2.031 |
| 87.666014619582 | -0.242 | -1.773 | -0.145 | 2.047 |
| 87.84103778441263 | -0.218 | -1.798 | -0.145 | 2.055 |
| 88.00576546895913 | -0.193 | -1.806 | -0.137 | 2.064 |
| 88.1704931535056 | -0.169 | -1.814 | -0.129 | 2.072 |
| 88.33522083805208 | -0.121 | -1.83 | -0.121 | 2.064 |
| 88.49994852259859 | -0.064 | -1.822 | -0.113 | 2.055 |
| 88.66467620714505 | -0.008 | -1.814 | -0.113 | 2.055 |
| 88.8396993719757 | 0.056 | -1.806 | -0.105 | 2.055 |
| 89.00442705652219 | 0.113 | -1.789 | -0.097 | 2.072 |
| 89.16915474106867 | 0.177 | -1.781 | -0.097 | 2.096 |
| 89.33388242561514 | 0.25 | -1.773 | -0.089 | 2.128 |
| 89.49861011016162 | 0.322 | -1.765 | -0.081 | 2.144 |
| 89.67363327499227 | 0.387 | -1.749 | -0.073 | 2.168 |
| 89.83836095953876 | 0.427 | -1.757 | -0.064 | 2.192 |
| 90.00308864408524 | 0.451 | -1.781 | -0.064 | 2.225 |
| 90.16781632863173 | 0.476 | -1.798 | -0.056 | 2.265 |
| 90.33254401317821 | 0.508 | -1.814 | -0.048 | 2.289 |
| 90.50756717800884 | 0.532 | -1.838 | -0.032 | 2.321 |
| 90.67229486255535 | 0.556 | -1.87 | -0.024 | 2.362 |
| 90.83702254710182 | 0.58 | -1.902 | -0.008 | 2.386 |
| 91.0017502316483 | 0.613 | -1.926 | 0.008 | 2.41 |
| 91.16647791619478 | 0.653 | -1.951 | 0.024 | 2.442 |
| 91.34150108102543 | 0.693 | -1.975 | 0.032 | 2.475 |
| 91.50622876557192 | 0.75 | -1.999 | 0.056 | 2.507 |
| 91.67095645011838 | 0.774 | -2.031 | 0.073 | 2.539 |
| 91.83568413466487 | 0.798 | -2.072 | 0.081 | 2.571 |
| 92.00041181921137 | 0.83 | -2.112 | 0.089 | 2.604 |
| 92.16513950375784 | 0.822 | -2.176 | 0.097 | 2.628 |
| 92.34016266858848 | 0.862 | -2.249 | 0.105 | 2.692 |
| 92.50489035313497 | 0.895 | -2.33 | 0.113 | 2.749 |
| 92.66961803768146 | 0.911 | -2.402 | 0.121 | 2.813 |
| 92.83434572222792 | 0.911 | -2.491 | 0.129 | 2.878 |
| 92.99907340677441 | 0.895 | -2.587 | 0.121 | 2.942 |
| 93.17409657160506 | 0.887 | -2.692 | 0.113 | 3.031 |
| 93.33882425615154 | 0.895 | -2.797 | 0.097 | 3.144 |
| 93.50355194069803 | 0.895 | -2.926 | 0.081 | 3.265 |
| 93.66827962524452 | 0.879 | -3.087 | 0.056 | 3.394 |
| 93.833007309791 | 0.862 | -3.248 | 0.024 | 3.539 |
| 94.00803047462163 | 0.838 | -3.418 | -0.008 | 3.676 |
| 94.17275815916813 | 0.806 | -3.587 | -0.032 | 3.821 |
| 94.3374858437146 | 0.782 | -3.772 | -0.056 | 3.982 |
| 94.5022135282611 | 0.774 | -3.934 | -0.097 | 4.135 |
| 94.66694121280757 | 0.79 | -4.087 | -0.137 | 4.28 |
| 94.83166889735405 | 0.798 | -4.232 | -0.185 | 4.401 |
| 95.0066920621847 | 0.822 | -4.377 | -0.234 | 4.53 |
| 95.17141974673117 | 0.887 | -4.506 | -0.274 | 4.675 |
| 95.33614743127767 | 0.975 | -4.619 | -0.33 | 4.812 |
| 95.50087511582414 | 1.032 | -4.748 | -0.387 | 4.957 |
| 95.66560280037064 | 1.112 | -4.836 | -0.451 | 5.078 |
| 95.84062596520126 | 1.201 | -4.933 | -0.516 | 5.207 |
| 96.00535364974776 | 1.266 | -5.038 | -0.596 | 5.336 |
| 96.17008133429425 | 1.338 | -5.135 | -0.669 | 5.457 |
| 96.33480901884072 | 1.427 | -5.199 | -0.742 | 5.554 |
| 96.49953670338721 | 1.499 | -5.247 | -0.806 | 5.634 |
| 96.67455986821784 | 1.572 | -5.28 | -0.887 | 5.707 |
| 96.83928755276433 | 1.66 | -5.304 | -0.967 | 5.771 |
| 97.00401523731081 | 1.733 | -5.312 | -1.056 | 5.828 |
| 97.1687429218573 | 1.806 | -5.328 | -1.145 | 5.884 |
| 97.3334706064038 | 1.886 | -5.32 | -1.225 | 5.925 |
| 97.49819829095026 | 1.967 | -5.304 | -1.306 | 5.957 |
| 97.67322145578092 | 2.039 | -5.288 | -1.386 | 5.981 |
| 97.8379491403274 | 2.12 | -5.231 | -1.451 | 5.973 |
| 98.00267682487387 | 2.192 | -5.175 | -1.515 | 5.965 |
| 98.16740450942035 | 2.265 | -5.127 | -1.588 | 5.973 |
| 98.33213219396683 | 2.321 | -5.11 | -1.669 | 5.997 |
| 98.50715535879748 | 2.378 | -5.102 | -1.733 | 6.037 |
| 98.67188304334397 | 2.434 | -5.086 | -1.781 | 6.054 |
| 98.83661072789045 | 2.475 | -5.03 | -1.83 | 6.037 |
| 99.00133841243694 | 2.507 | -4.965 | -1.886 | 6.013 |
| 99.16606609698341 | 2.539 | -4.893 | -1.918 | 5.973 |
| 99.34108926181405 | 2.571 | -4.804 | -1.951 | 5.916 |
| 99.50581694636055 | 2.587 | -4.715 | -1.983 | 5.852 |
| 99.67054463090703 | 2.587 | -4.627 | -2.015 | 5.788 |
| 99.83527231545351 | 2.587 | -4.538 | -2.047 | 5.723 |
| 100.0 | 2.596 | -4.466 | -2.08 | 5.675 |